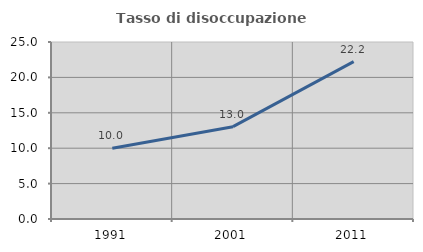
| Category | Tasso di disoccupazione giovanile  |
|---|---|
| 1991.0 | 10 |
| 2001.0 | 13.043 |
| 2011.0 | 22.222 |